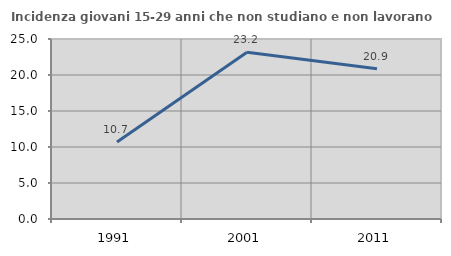
| Category | Incidenza giovani 15-29 anni che non studiano e non lavorano  |
|---|---|
| 1991.0 | 10.688 |
| 2001.0 | 23.158 |
| 2011.0 | 20.879 |